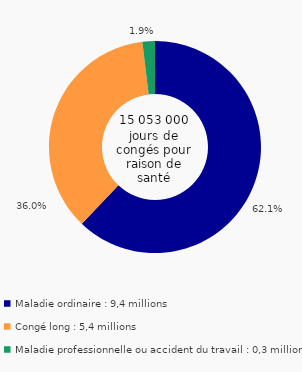
| Category | Series 0 |
|---|---|
| Maladie ordinaire : 9,4 millions | 0.621 |
| Congé long : 5,4 millions | 0.36 |
| Maladie professionnelle ou accident du travail : 0,3 million | 0.019 |